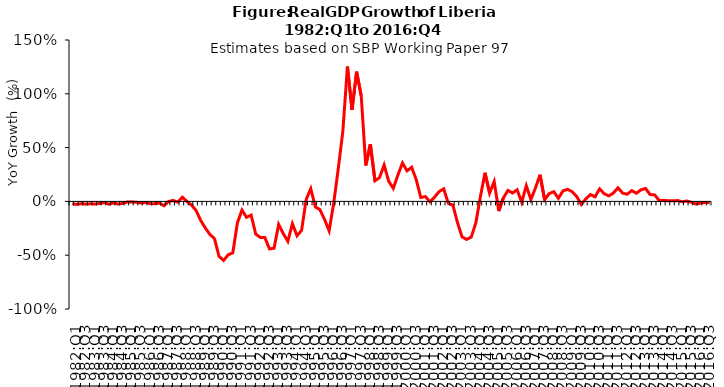
| Category | Series 0 |
|---|---|
| 1982:Q1 | -0.024 |
| 1982:Q2 | -0.027 |
| 1982:Q3 | -0.021 |
| 1982:Q4 | -0.026 |
| 1983:Q1 | -0.022 |
| 1983:Q2 | -0.025 |
| 1983:Q3 | -0.019 |
| 1983:Q4 | -0.011 |
| 1984:Q1 | -0.027 |
| 1984:Q2 | -0.014 |
| 1984:Q3 | -0.025 |
| 1984:Q4 | -0.019 |
| 1985:Q1 | -0.005 |
| 1985:Q2 | -0.006 |
| 1985:Q3 | -0.008 |
| 1985:Q4 | -0.015 |
| 1986:Q1 | -0.009 |
| 1986:Q2 | -0.022 |
| 1986:Q3 | -0.021 |
| 1986:Q4 | -0.016 |
| 1987:Q1 | -0.041 |
| 1987:Q2 | -0.001 |
| 1987:Q3 | 0.009 |
| 1987:Q4 | -0.007 |
| 1988:Q1 | 0.039 |
| 1988:Q2 | 0 |
| 1988:Q3 | -0.034 |
| 1988:Q4 | -0.085 |
| 1989:Q1 | -0.177 |
| 1989:Q2 | -0.247 |
| 1989:Q3 | -0.307 |
| 1989:Q4 | -0.346 |
| 1990:Q1 | -0.511 |
| 1990:Q2 | -0.548 |
| 1990:Q3 | -0.496 |
| 1990:Q4 | -0.478 |
| 1991:Q1 | -0.2 |
| 1991:Q2 | -0.081 |
| 1991:Q3 | -0.148 |
| 1991:Q4 | -0.127 |
| 1992:Q1 | -0.304 |
| 1992:Q2 | -0.335 |
| 1992:Q3 | -0.336 |
| 1992:Q4 | -0.442 |
| 1993:Q1 | -0.435 |
| 1993:Q2 | -0.214 |
| 1993:Q3 | -0.299 |
| 1993:Q4 | -0.371 |
| 1994:Q1 | -0.208 |
| 1994:Q2 | -0.319 |
| 1994:Q3 | -0.269 |
| 1994:Q4 | 0.017 |
| 1995:Q1 | 0.118 |
| 1995:Q2 | -0.052 |
| 1995:Q3 | -0.076 |
| 1995:Q4 | -0.167 |
| 1996:Q1 | -0.273 |
| 1996:Q2 | -0.018 |
| 1996:Q3 | 0.304 |
| 1996:Q4 | 0.652 |
| 1997:Q1 | 1.253 |
| 1997:Q2 | 0.851 |
| 1997:Q3 | 1.206 |
| 1997:Q4 | 0.983 |
| 1998:Q1 | 0.334 |
| 1998:Q2 | 0.532 |
| 1998:Q3 | 0.192 |
| 1998:Q4 | 0.221 |
| 1999:Q1 | 0.338 |
| 1999:Q2 | 0.187 |
| 1999:Q3 | 0.122 |
| 1999:Q4 | 0.244 |
| 2000:Q1 | 0.357 |
| 2000:Q2 | 0.284 |
| 2000:Q3 | 0.317 |
| 2000:Q4 | 0.202 |
| 2001:Q1 | 0.036 |
| 2001:Q2 | 0.045 |
| 2001:Q3 | -0.004 |
| 2001:Q4 | 0.04 |
| 2002:Q1 | 0.091 |
| 2002:Q2 | 0.117 |
| 2002:Q3 | -0.019 |
| 2002:Q4 | -0.035 |
| 2003:Q1 | -0.197 |
| 2003:Q2 | -0.331 |
| 2003:Q3 | -0.353 |
| 2003:Q4 | -0.332 |
| 2004:Q1 | -0.2 |
| 2004:Q2 | 0.045 |
| 2004:Q3 | 0.266 |
| 2004:Q4 | 0.077 |
| 2005:Q1 | 0.184 |
| 2005:Q2 | -0.09 |
| 2005:Q3 | 0.032 |
| 2005:Q4 | 0.102 |
| 2006:Q1 | 0.078 |
| 2006:Q2 | 0.108 |
| 2006:Q3 | -0.008 |
| 2006:Q4 | 0.146 |
| 2007:Q1 | 0.017 |
| 2007:Q2 | 0.125 |
| 2007:Q3 | 0.248 |
| 2007:Q4 | 0.015 |
| 2008:Q1 | 0.073 |
| 2008:Q2 | 0.09 |
| 2008:Q3 | 0.029 |
| 2008:Q4 | 0.098 |
| 2009:Q1 | 0.112 |
| 2009:Q2 | 0.09 |
| 2009:Q3 | 0.045 |
| 2009:Q4 | -0.028 |
| 2010:Q1 | 0.025 |
| 2010:Q2 | 0.063 |
| 2010:Q3 | 0.042 |
| 2010:Q4 | 0.117 |
| 2011:Q1 | 0.071 |
| 2011:Q2 | 0.051 |
| 2011:Q3 | 0.078 |
| 2011:Q4 | 0.127 |
| 2012:Q1 | 0.077 |
| 2012:Q2 | 0.066 |
| 2012:Q3 | 0.1 |
| 2012:Q4 | 0.076 |
| 2013:Q1 | 0.107 |
| 2013:Q2 | 0.121 |
| 2013:Q3 | 0.064 |
| 2013:Q4 | 0.06 |
| 2014:Q1 | 0.008 |
| 2014:Q2 | 0.01 |
| 2014:Q3 | 0.005 |
| 2014:Q4 | 0.005 |
| 2015:Q1 | 0.008 |
| 2015:Q2 | -0.004 |
| 2015:Q3 | 0.004 |
| 2015:Q4 | -0.008 |
| 2016:Q1 | -0.025 |
| 2016:Q2 | -0.016 |
| 2016:Q3 | -0.01 |
| 2016:Q4 | -0.014 |